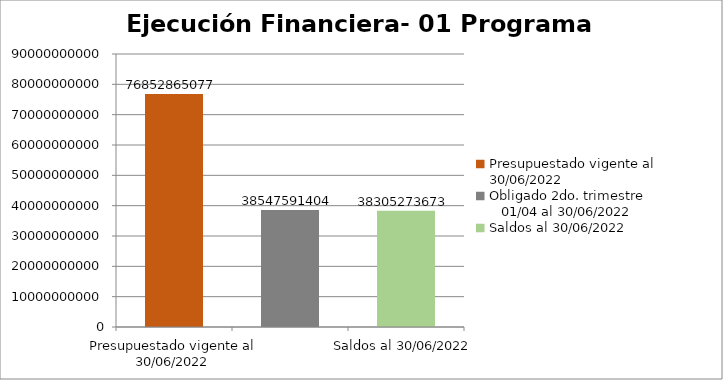
| Category | Presupuestado vigente al 30/06/2022 Obligado 2do. trimestre                      01/04 al 30/06/2022 Saldos al 30/06/2022 |
|---|---|
| Presupuestado vigente al 30/06/2022 | 76852865077 |
| Obligado 2do. trimestre                      01/04 al 30/06/2022 | 38547591404 |
| Saldos al 30/06/2022 | 38305273673 |